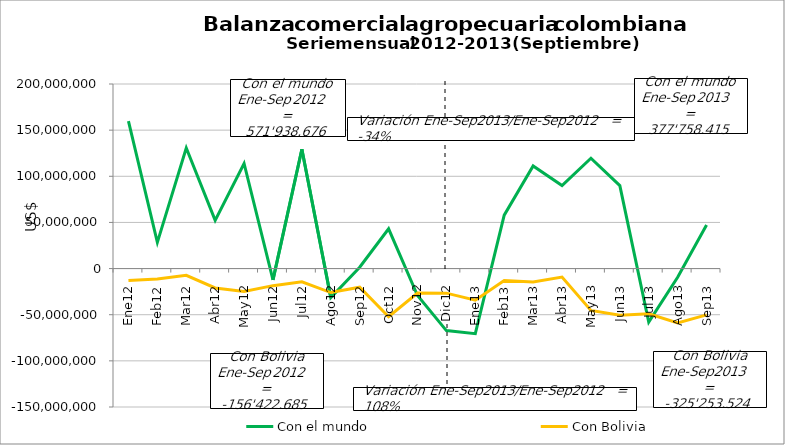
| Category | Con el mundo | Con Bolivia |
|---|---|---|
| 0 | 159718811.51 | -13042565.26 |
| 1 | 28364992.2 | -11219851.08 |
| 2 | 130703935.59 | -7329041.26 |
| 3 | 52247887.52 | -20962189.69 |
| 4 | 113869665.14 | -24940502.58 |
| 5 | -12237508.2 | -18496529.16 |
| 6 | 129307489.88 | -14274178.68 |
| 7 | -31469488.76 | -25975401.89 |
| 8 | 1432890.8 | -20182425.85 |
| 9 | 43089965.32 | -52241399 |
| 10 | -29233849.86 | -26542013.6 |
| 11 | -67196809.33 | -26644900.28 |
| 12 | -70591672.64 | -34302245.31 |
| 13 | 57888002.76 | -12967522.89 |
| 14 | 111239208.87 | -14510409.31 |
| 15 | 90043885.64 | -9207070.27 |
| 16 | 119554876.57 | -45397474.75 |
| 17 | 89894947.57 | -50689794.62 |
| 18 | -58064700.6 | -49054333.16 |
| 19 | -9356684.56 | -58912157.69 |
| 20 | 47150551.01 | -50212515.52 |